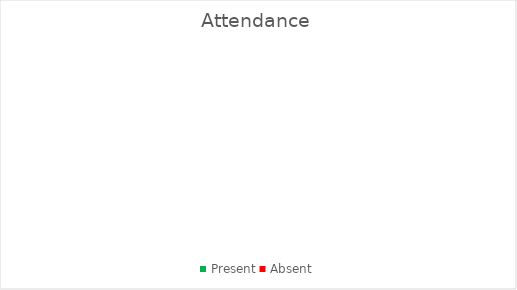
| Category | Series 0 |
|---|---|
| Present | 0 |
| Absent | 0 |